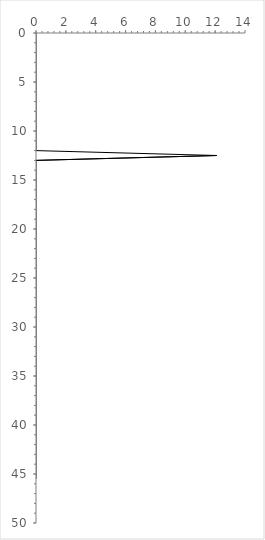
| Category | Series 0 |
|---|---|
| 0.0 | 0 |
| 0.0 | 0.5 |
| 0.0 | 1 |
| 0.0 | 1.5 |
| 0.0 | 2 |
| 0.0 | 2.5 |
| 0.0 | 3 |
| 0.0 | 3.5 |
| 0.0 | 4 |
| 0.0 | 4.5 |
| 0.0 | 5 |
| 0.0 | 5.5 |
| 0.0 | 6 |
| 0.0 | 6.5 |
| 0.0 | 7 |
| 0.0 | 7.5 |
| 0.0 | 8 |
| 0.0 | 8.5 |
| 0.0 | 9 |
| 0.0 | 9.5 |
| 0.0 | 10 |
| 0.0 | 10.5 |
| 0.0 | 11 |
| 0.0 | 11.5 |
| 0.0 | 12 |
| 12.121212121212123 | 12.5 |
| 0.0 | 13 |
| 0.0 | 13.5 |
| 0.0 | 14 |
| 0.0 | 14.5 |
| 0.0 | 15 |
| 0.0 | 15.5 |
| 0.0 | 16 |
| 0.0 | 16.5 |
| 0.0 | 17 |
| 0.0 | 17.5 |
| 0.0 | 18 |
| 0.0 | 18.5 |
| 0.0 | 19 |
| 0.0 | 19.5 |
| 0.0 | 20 |
| 0.0 | 20.5 |
| 0.0 | 21 |
| 0.0 | 21.5 |
| 0.0 | 22 |
| 0.0 | 22.5 |
| 0.0 | 23 |
| 0.0 | 23.5 |
| 0.0 | 24 |
| 0.0 | 24.5 |
| 0.0 | 25 |
| 0.0 | 25.5 |
| 0.0 | 26 |
| 0.0 | 26.5 |
| 0.0 | 27 |
| 0.0 | 27.5 |
| 0.0 | 28 |
| 0.0 | 28.5 |
| 0.0 | 29 |
| 0.0 | 29.5 |
| 0.0 | 30 |
| 0.0 | 30.5 |
| 0.0 | 31 |
| 0.0 | 31.5 |
| 0.0 | 32 |
| 0.0 | 32.5 |
| 0.0 | 33 |
| 0.0 | 33.5 |
| 0.0 | 34 |
| 0.0 | 34.5 |
| 0.0 | 35 |
| 0.0 | 35.5 |
| 0.0 | 36 |
| 0.0 | 36.5 |
| 0.0 | 37 |
| 0.0 | 37.5 |
| 0.0 | 38 |
| 0.0 | 38.5 |
| 0.0 | 39 |
| 0.0 | 39.5 |
| 0.0 | 40 |
| 0.0 | 40.5 |
| 0.0 | 41 |
| 0.0 | 41.5 |
| 0.0 | 42 |
| 0.0 | 42.5 |
| 0.0 | 43 |
| 0.0 | 43.5 |
| 0.0 | 44 |
| 0.0 | 44.5 |
| 0.0 | 45 |
| 0.0 | 45.5 |